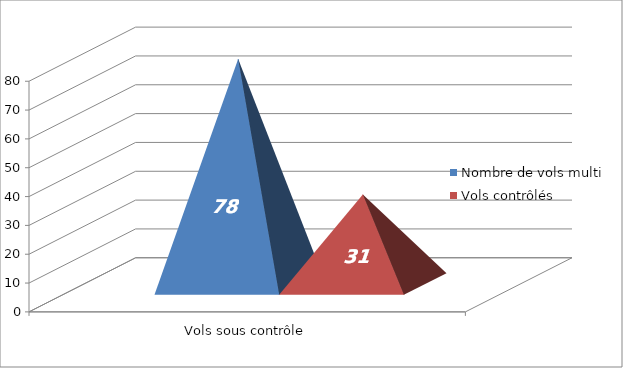
| Category | Nombre de vols multi | Vols contrôlés |
|---|---|---|
| 0 | 78 | 31 |